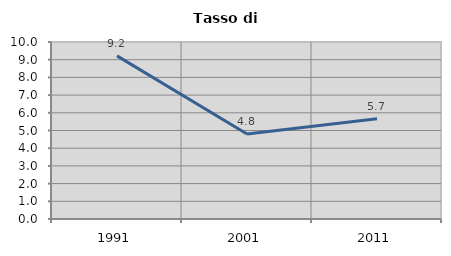
| Category | Tasso di disoccupazione   |
|---|---|
| 1991.0 | 9.215 |
| 2001.0 | 4.806 |
| 2011.0 | 5.668 |